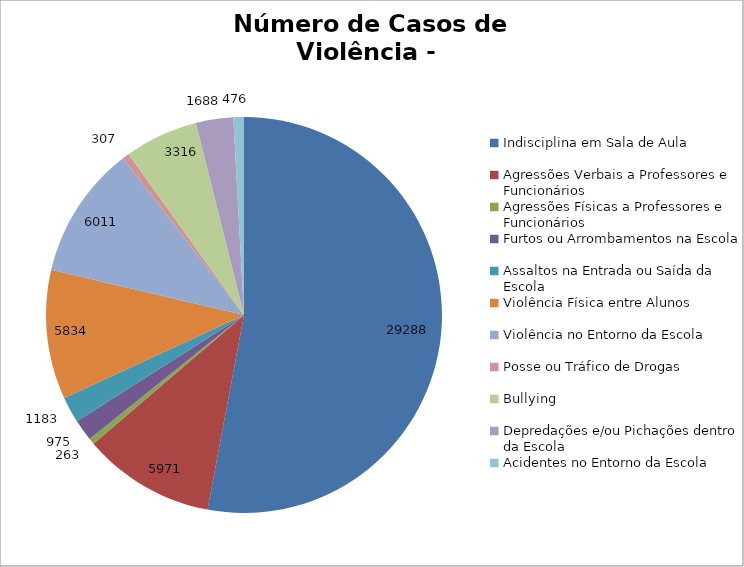
| Category | Número de Casos |
|---|---|
| Indisciplina em Sala de Aula | 29288 |
| Agressões Verbais a Professores e Funcionários | 5971 |
| Agressões Físicas a Professores e Funcionários | 263 |
| Furtos ou Arrombamentos na Escola | 975 |
| Assaltos na Entrada ou Saída da Escola | 1183 |
| Violência Física entre Alunos | 5834 |
| Violência no Entorno da Escola | 6011 |
| Posse ou Tráfico de Drogas | 307 |
| Bullying | 3316 |
| Depredações e/ou Pichações dentro da Escola | 1688 |
| Acidentes no Entorno da Escola | 476 |